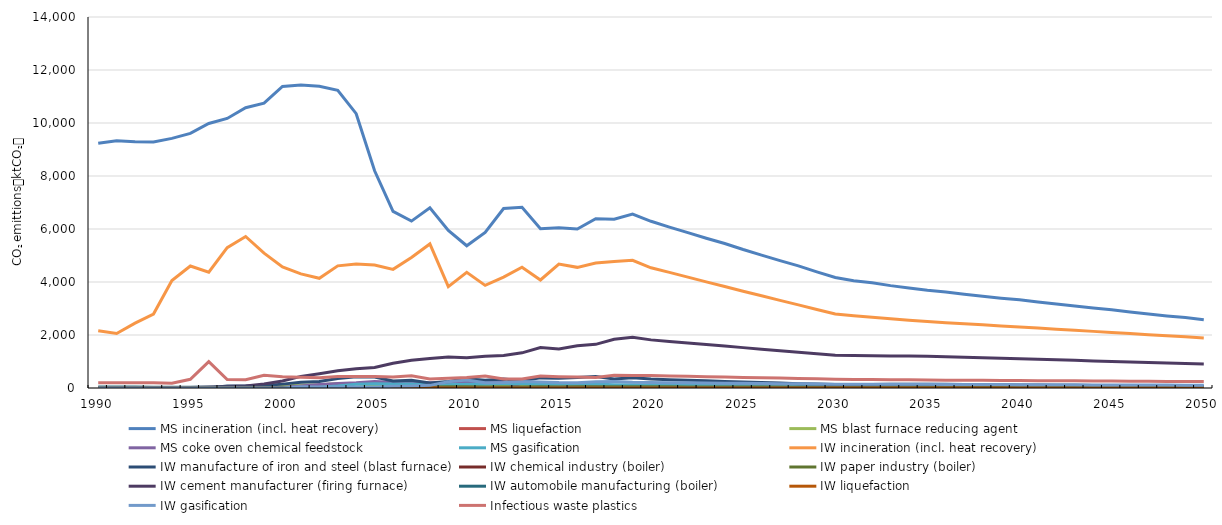
| Category | MS incineration (incl. heat recovery) | MS liquefaction | MS blast furnace reducing agent | MS coke oven chemical feedstock | MS gasification | IW incineration (incl. heat recovery) | IW manufacture of iron and steel (blast furnace) | IW chemical industry (boiler) | IW paper industry (boiler) | IW cement manufacturer (firing furnace) | IW automobile manufacturing (boiler) | IW liquefaction | IW gasification | Infectious waste plastics |
|---|---|---|---|---|---|---|---|---|---|---|---|---|---|---|
| 1990.0 | 9232.162 | 0 | 0 | 0 | 0 | 2161.919 | 0 | 13.696 | 0 | 0 | 40.896 | 0 | 0 | 199.414 |
| 1991.0 | 9333.778 | 0 | 0 | 0 | 0 | 2056.429 | 0 | 11.491 | 0 | 0 | 42.116 | 0 | 0 | 199.414 |
| 1992.0 | 9296.826 | 0 | 0 | 0 | 0 | 2448.872 | 0 | 6.945 | 0 | 0 | 36.916 | 0 | 0 | 199.414 |
| 1993.0 | 9280.437 | 0 | 0 | 0 | 0 | 2790.496 | 0 | 14.271 | 0 | 0 | 29.484 | 0 | 0 | 199.414 |
| 1994.0 | 9419.005 | 0 | 0 | 0 | 0 | 4055.239 | 0 | 11.581 | 0 | 0 | 25.797 | 0 | 0 | 176.937 |
| 1995.0 | 9607.337 | 0 | 0 | 0 | 0 | 4604.167 | 0 | 9.971 | 0 | 23.1 | 26.1 | 0 | 0 | 328.196 |
| 1996.0 | 9982.512 | 0 | 0 | 0 | 0 | 4369.814 | 0 | 9.664 | 0 | 33.367 | 26.346 | 0 | 0 | 997.343 |
| 1997.0 | 10172.632 | 0 | 0 | 0 | 0 | 5298.031 | 77 | 16.311 | 0 | 56.467 | 26.666 | 0 | 0 | 319.555 |
| 1998.0 | 10577.308 | 0 | 0 | 0 | 0 | 5717.106 | 77 | 14.301 | 0 | 74.433 | 27.03 | 0 | 0 | 309.428 |
| 1999.0 | 10746.941 | 0 | 0 | 0 | 0 | 5090.14 | 94.967 | 12.24 | 3.272 | 154 | 24.419 | 0 | 0 | 476.96 |
| 2000.0 | 11381.151 | 9.086 | 67.918 | 15.353 | 1.725 | 4568.159 | 146.23 | 12.24 | 7.271 | 261.8 | 20.281 | 1.902 | 0 | 428.049 |
| 2001.0 | 11431.517 | 21.576 | 115.789 | 73.079 | 20.354 | 4306.32 | 218.843 | 9.201 | 4.397 | 438.9 | 16.679 | 4.143 | 47.902 | 403.514 |
| 2002.0 | 11389.547 | 18.467 | 127.13 | 129.755 | 30.246 | 4139.699 | 245.919 | 13.635 | 4.615 | 541.567 | 15.787 | 6.045 | 35.9 | 387.901 |
| 2003.0 | 11236.125 | 15.807 | 161.005 | 172.585 | 75.902 | 4609.053 | 358.978 | 15.462 | 3.647 | 654.5 | 13.8 | 3.121 | 33.117 | 431.88 |
| 2004.0 | 10351.877 | 17.372 | 151.965 | 195.601 | 141.129 | 4679.456 | 423.134 | 10.778 | 3.624 | 726.367 | 12.703 | 2.161 | 35.164 | 438.477 |
| 2005.0 | 8195.45 | 18.886 | 99.396 | 246.454 | 158.371 | 4639.56 | 410.578 | 5.59 | 7.081 | 775.133 | 10.262 | 1.886 | 27.858 | 434.739 |
| 2006.0 | 6664.177 | 11.852 | 105.099 | 219.372 | 147.331 | 4477.633 | 262.025 | 5.136 | 22.181 | 936.833 | 9.92 | 5.765 | 66.089 | 419.566 |
| 2007.0 | 6298.268 | 11.496 | 88.671 | 200.451 | 152.631 | 4926.168 | 289 | 2.9 | 36.208 | 1047.2 | 0 | 3.629 | 74.151 | 461.595 |
| 2008.0 | 6802.764 | 7.371 | 46.841 | 199.091 | 126.045 | 5436.199 | 190.099 | 4.222 | 41.788 | 1116.5 | 0 | 7.682 | 99.151 | 336.233 |
| 2009.0 | 5946.396 | 18.165 | 74.503 | 210.641 | 120.354 | 3825.616 | 247.868 | 3.529 | 44.873 | 1172.966 | 0 | 2.723 | 235.473 | 365.75 |
| 2010.0 | 5367.407 | 2.853 | 72.081 | 248.579 | 143.019 | 4366.498 | 344.841 | 3.374 | 45.662 | 1140.982 | 0 | 1.572 | 299.091 | 395.267 |
| 2011.0 | 5872.206 | 0 | 69.703 | 237.857 | 138.567 | 3872.877 | 292.985 | 2.942 | 41.202 | 1202.104 | 0 | 2.417 | 199.847 | 451.733 |
| 2012.0 | 6773.721 | 0 | 70.273 | 240.671 | 166.072 | 4181.915 | 344.033 | 2.893 | 39.585 | 1227.413 | 0 | 2.637 | 203.229 | 336.233 |
| 2013.0 | 6819.134 | 0 | 82.074 | 0 | 157.413 | 4555.463 | 275.35 | 1.683 | 36.429 | 1327.182 | 0 | 2.452 | 249.569 | 341.367 |
| 2014.0 | 6010.26 | 0 | 72.425 | 24.344 | 136.361 | 4075.856 | 381.673 | 0.932 | 44.891 | 1524.283 | 0 | 2.723 | 229.57 | 451.733 |
| 2015.0 | 6048.435 | 0 | 82.252 | 40.648 | 147.874 | 4677.258 | 369.798 | 1.148 | 40.815 | 1475.411 | 0 | 2.797 | 208.03 | 426.067 |
| 2016.0 | 5999.672 | 0 | 78.958 | 34.624 | 146.511 | 4553.026 | 400.512 | 0.56 | 43.701 | 1596.25 | 0 | 0.287 | 202.547 | 410.667 |
| 2017.0 | 6385.103 | 0 | 75.878 | 44.997 | 153.427 | 4713.9 | 431.468 | 7.73 | 46.993 | 1647.303 | 0 | 0 | 232.39 | 395.267 |
| 2018.0 | 6370.25 | 0 | 76.61 | 23.96 | 124.355 | 4777.442 | 336.891 | 8.899 | 47.369 | 1840.238 | 0 | 2.002 | 249.734 | 479.967 |
| 2019.0 | 6561.602 | 0 | 74.293 | 33.716 | 119.797 | 4816.964 | 382.195 | 9.89 | 46.373 | 1912.43 | 0 | 2.002 | 220.309 | 474.833 |
| 2020.0 | 6290.759 | 0 | 71.664 | 32.523 | 115.558 | 4534.998 | 337.207 | 9.39 | 44.028 | 1815.759 | 0 | 1.901 | 209.172 | 474.833 |
| 2021.0 | 6069.373 | 0 | 69.765 | 31.661 | 112.495 | 4364.507 | 315.513 | 9.092 | 42.629 | 1758.059 | 0 | 1.841 | 202.526 | 453.775 |
| 2022.0 | 5860.949 | 0 | 68.034 | 30.875 | 109.705 | 4185.253 | 292.382 | 8.789 | 41.211 | 1699.572 | 0 | 1.779 | 195.788 | 440.39 |
| 2023.0 | 5650.397 | 0 | 66.26 | 30.07 | 106.844 | 4006.391 | 269.663 | 8.486 | 39.789 | 1640.9 | 0 | 1.718 | 189.029 | 426.932 |
| 2024.0 | 5454.44 | 0 | 64.671 | 29.349 | 104.282 | 3828.105 | 245.829 | 8.182 | 38.363 | 1582.116 | 0 | 1.656 | 182.257 | 413.477 |
| 2025.0 | 5225.138 | 0 | 62.606 | 28.412 | 100.951 | 3650.887 | 225.647 | 7.878 | 36.94 | 1523.412 | 0 | 1.595 | 175.495 | 400.003 |
| 2026.0 | 5016.142 | 0 | 60.801 | 27.593 | 98.04 | 3478.514 | 205.365 | 7.583 | 35.558 | 1466.424 | 0 | 1.535 | 168.93 | 386.625 |
| 2027.0 | 4805.943 | 0 | 58.958 | 26.756 | 95.069 | 3306.478 | 185.513 | 7.288 | 34.172 | 1409.266 | 0 | 1.475 | 162.345 | 373.62 |
| 2028.0 | 4609.919 | 0 | 57.288 | 25.999 | 92.376 | 3135.389 | 164.683 | 6.992 | 32.784 | 1352.012 | 0 | 1.415 | 155.75 | 360.617 |
| 2029.0 | 4382.302 | 0 | 55.159 | 25.032 | 88.943 | 2964.747 | 147.189 | 6.694 | 31.386 | 1294.391 | 0 | 1.355 | 149.112 | 347.589 |
| 2030.0 | 4168.752 | 0 | 53.196 | 24.141 | 85.777 | 2794.997 | 128.764 | 6.395 | 29.984 | 1236.569 | 0 | 1.295 | 142.451 | 334.615 |
| 2031.0 | 4051.146 | 0 | 52.496 | 23.824 | 84.65 | 2727.866 | 131.273 | 6.325 | 29.657 | 1223.063 | 0 | 1.28 | 140.895 | 321.617 |
| 2032.0 | 3967.762 | 0 | 52.237 | 23.706 | 84.231 | 2667.976 | 133.106 | 6.286 | 29.475 | 1215.573 | 0 | 1.273 | 140.032 | 316.706 |
| 2033.0 | 3863.278 | 0 | 51.672 | 23.45 | 83.32 | 2613.029 | 137.854 | 6.258 | 29.342 | 1210.091 | 0 | 1.267 | 139.4 | 311.77 |
| 2034.0 | 3775.507 | 0 | 51.328 | 23.294 | 82.766 | 2560.428 | 141.414 | 6.234 | 29.232 | 1205.538 | 0 | 1.262 | 138.876 | 306.888 |
| 2035.0 | 3688.513 | 0 | 50.988 | 23.14 | 82.218 | 2508.794 | 145.04 | 6.212 | 29.128 | 1201.267 | 0 | 1.258 | 138.384 | 301.981 |
| 2036.0 | 3626.607 | 0 | 50.132 | 22.751 | 80.838 | 2466.764 | 138.216 | 6.106 | 28.632 | 1180.798 | 0 | 1.236 | 136.026 | 297.075 |
| 2037.0 | 3538.724 | 0 | 48.918 | 22.2 | 78.879 | 2424.655 | 134.055 | 6.002 | 28.143 | 1160.642 | 0 | 1.215 | 133.704 | 293.101 |
| 2038.0 | 3464.652 | 0 | 47.894 | 21.735 | 77.228 | 2383.213 | 128.738 | 5.9 | 27.663 | 1140.835 | 0 | 1.194 | 131.422 | 289.178 |
| 2039.0 | 3390.595 | 0 | 46.87 | 21.271 | 75.577 | 2342.069 | 123.504 | 5.798 | 27.186 | 1121.161 | 0 | 1.174 | 129.156 | 285.231 |
| 2040.0 | 3329.613 | 0 | 46.027 | 20.888 | 74.218 | 2301.437 | 117.142 | 5.697 | 26.715 | 1101.741 | 0 | 1.153 | 126.919 | 281.286 |
| 2041.0 | 3242.213 | 0 | 44.819 | 20.34 | 72.27 | 2260.215 | 113.235 | 5.595 | 26.237 | 1082.01 | 0 | 1.133 | 124.646 | 277.316 |
| 2042.0 | 3167.499 | 0 | 43.786 | 19.871 | 70.604 | 2219.075 | 108.167 | 5.494 | 25.76 | 1062.347 | 0 | 1.112 | 122.381 | 273.396 |
| 2043.0 | 3092.768 | 0 | 42.753 | 19.402 | 68.939 | 2177.977 | 103.139 | 5.392 | 25.283 | 1042.694 | 0 | 1.092 | 120.117 | 269.452 |
| 2044.0 | 3018.062 | 0 | 41.72 | 18.934 | 67.273 | 2136.872 | 98.145 | 5.29 | 24.807 | 1023.038 | 0 | 1.071 | 117.852 | 265.508 |
| 2045.0 | 2955.923 | 0 | 40.861 | 18.544 | 65.888 | 2096.164 | 92.05 | 5.19 | 24.335 | 1003.581 | 0 | 1.051 | 115.611 | 261.565 |
| 2046.0 | 2869.239 | 0 | 39.663 | 18 | 63.956 | 2054.818 | 88.243 | 5.088 | 23.855 | 983.79 | 0 | 1.03 | 113.331 | 257.598 |
| 2047.0 | 2794.803 | 0 | 38.634 | 17.533 | 62.297 | 2013.528 | 83.316 | 4.985 | 23.376 | 964.054 | 0 | 1.009 | 111.057 | 253.678 |
| 2048.0 | 2720.644 | 0 | 37.609 | 17.068 | 60.644 | 1972.276 | 78.41 | 4.883 | 22.898 | 944.327 | 0 | 0.989 | 108.785 | 249.734 |
| 2049.0 | 2658.595 | 0 | 36.751 | 16.678 | 59.261 | 1931.444 | 72.455 | 4.782 | 22.425 | 924.809 | 0 | 0.968 | 106.536 | 245.791 |
| 2050.0 | 2573.356 | 0 | 35.573 | 16.144 | 57.361 | 1889.982 | 68.677 | 4.68 | 21.944 | 904.964 | 0 | 0.947 | 104.25 | 241.824 |